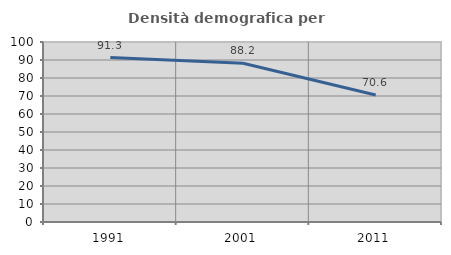
| Category | Densità demografica |
|---|---|
| 1991.0 | 91.331 |
| 2001.0 | 88.217 |
| 2011.0 | 70.602 |